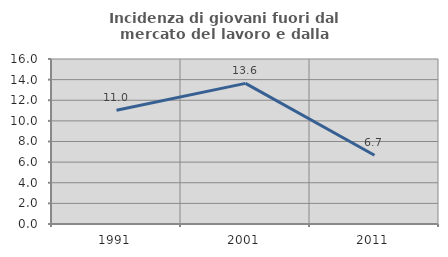
| Category | Incidenza di giovani fuori dal mercato del lavoro e dalla formazione  |
|---|---|
| 1991.0 | 11.024 |
| 2001.0 | 13.636 |
| 2011.0 | 6.667 |